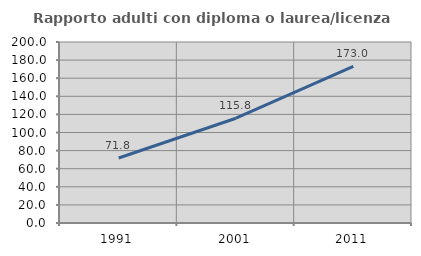
| Category | Rapporto adulti con diploma o laurea/licenza media  |
|---|---|
| 1991.0 | 71.813 |
| 2001.0 | 115.789 |
| 2011.0 | 173.013 |